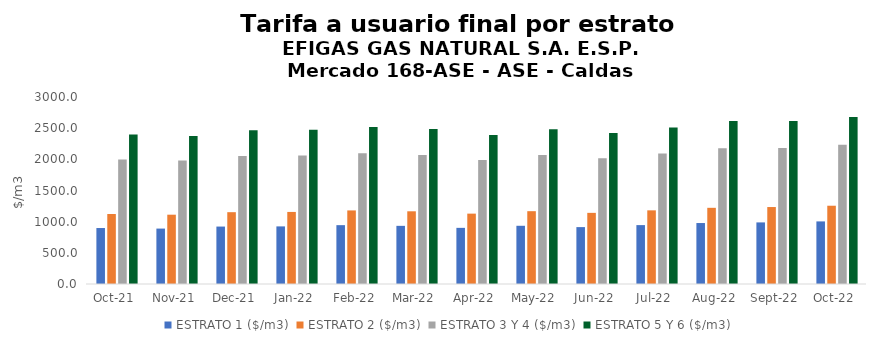
| Category | ESTRATO 1 ($/m3) | ESTRATO 2 ($/m3) | ESTRATO 3 Y 4 ($/m3) | ESTRATO 5 Y 6 ($/m3) |
|---|---|---|---|---|
| 2021-10-01 | 897.94 | 1122.79 | 1997.45 | 2396.94 |
| 2021-11-01 | 889.08 | 1111.91 | 1980.02 | 2376.024 |
| 2021-12-01 | 921.46 | 1152.18 | 2054.23 | 2465.076 |
| 2022-01-01 | 924.14 | 1156.04 | 2062.48 | 2474.976 |
| 2022-02-01 | 944.04 | 1180.34 | 2097.94 | 2517.528 |
| 2022-03-01 | 932.97 | 1166.33 | 2071.37 | 2485.644 |
| 2022-04-01 | 900.71 | 1128.96 | 1991.18 | 2389.416 |
| 2022-05-01 | 934.06 | 1168.18 | 2068.29 | 2481.948 |
| 2022-06-01 | 912.8 | 1141.29 | 2017.99 | 2421.588 |
| 2022-07-01 | 944.85 | 1181.63 | 2092.55 | 2511.06 |
| 2022-08-01 | 978.13 | 1222.23 | 2179.73 | 2615.676 |
| 2022-09-01 | 988.13 | 1234.73 | 2180.8 | 2616.96 |
| 2022-10-01 | 1004.17 | 1255.69 | 2233.24 | 2679.888 |